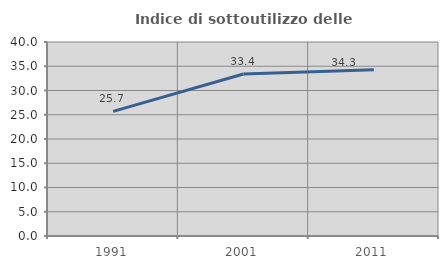
| Category | Indice di sottoutilizzo delle abitazioni  |
|---|---|
| 1991.0 | 25.693 |
| 2001.0 | 33.392 |
| 2011.0 | 34.266 |